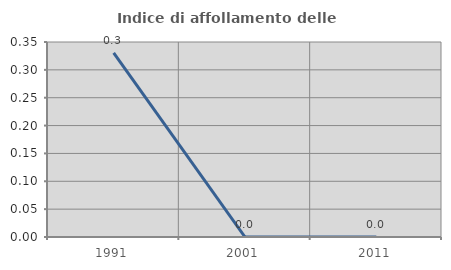
| Category | Indice di affollamento delle abitazioni  |
|---|---|
| 1991.0 | 0.331 |
| 2001.0 | 0 |
| 2011.0 | 0 |